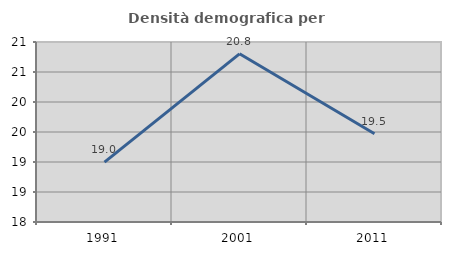
| Category | Densità demografica |
|---|---|
| 1991.0 | 18.998 |
| 2001.0 | 20.803 |
| 2011.0 | 19.47 |